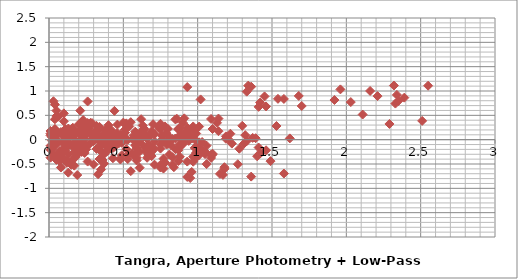
| Category | Series 0 |
|---|---|
| 0.03999999999999915 | 0.722 |
| 0.16000000000000014 | 0.245 |
| 0.1999999999999993 | 0.313 |
| 0.20999999999999908 | 0.188 |
| 0.22000000000000064 | 0.367 |
| 0.23000000000000043 | -0.004 |
| 0.2599999999999998 | 0.785 |
| 0.33999999999999986 | 0.213 |
| 0.39000000000000057 | 0.107 |
| 0.4399999999999995 | 0.592 |
| 0.5199999999999996 | 0.335 |
| 0.5899999999999999 | 0.075 |
| 0.629999999999999 | 0.293 |
| 0.8499999999999996 | 0.417 |
| 0.8699999999999992 | 0.209 |
| 0.9700000000000006 | 0.271 |
| 1.0099999999999998 | 0.269 |
| 1.0899999999999999 | 0.425 |
| 1.0999999999999996 | 0.219 |
| 1.129999999999999 | 0.346 |
| 1.1400000000000006 | 0.434 |
| 1.1899999999999995 | 0.019 |
| 1.209999999999999 | -0.002 |
| 1.2200000000000006 | 0.122 |
| 1.5299999999999994 | 0.281 |
| 1.6199999999999992 | 0.027 |
| 2.5500000000000007 | 1.108 |
| 0.120000000000001 | -0.477 |
| 0.16000000000000014 | -0.409 |
| 0.16999999999999993 | -0.534 |
| 0.1800000000000015 | -0.356 |
| 0.19000000000000128 | -0.726 |
| 0.22000000000000064 | 0.063 |
| 0.3000000000000007 | -0.509 |
| 0.3500000000000014 | -0.615 |
| 0.40000000000000036 | -0.13 |
| 0.4800000000000004 | -0.387 |
| 0.5500000000000007 | -0.647 |
| 0.5899999999999999 | -0.429 |
| 0.8100000000000005 | -0.306 |
| 0.8300000000000001 | -0.513 |
| 0.9300000000000015 | -0.451 |
| 0.9700000000000006 | -0.453 |
| 1.0500000000000007 | -0.297 |
| 1.0600000000000005 | -0.503 |
| 1.0899999999999999 | -0.376 |
| 1.1000000000000014 | -0.288 |
| 1.1500000000000004 | -0.703 |
| 1.17 | -0.724 |
| 1.1800000000000015 | -0.6 |
| 1.4900000000000002 | -0.441 |
| 1.58 | -0.696 |
| 2.5100000000000016 | 0.386 |
| 0.03999999999999915 | 0.068 |
| 0.049999999999998934 | -0.057 |
| 0.0600000000000005 | 0.122 |
| 0.07000000000000028 | -0.249 |
| 0.09999999999999964 | 0.54 |
| 0.17999999999999972 | -0.032 |
| 0.23000000000000043 | -0.138 |
| 0.27999999999999936 | 0.347 |
| 0.35999999999999943 | 0.09 |
| 0.4299999999999997 | -0.17 |
| 0.46999999999999886 | 0.048 |
| 0.6899999999999995 | 0.172 |
| 0.7099999999999991 | -0.036 |
| 0.8100000000000005 | 0.026 |
| 0.8499999999999996 | 0.024 |
| 0.9299999999999997 | 0.18 |
| 0.9399999999999995 | -0.026 |
| 0.9699999999999989 | 0.101 |
| 0.9800000000000004 | 0.189 |
| 1.0299999999999994 | -0.226 |
| 1.049999999999999 | -0.247 |
| 1.0600000000000005 | -0.123 |
| 1.3699999999999992 | 0.036 |
| 1.459999999999999 | -0.218 |
| 2.3900000000000006 | 0.863 |
| 0.009999999999999787 | -0.125 |
| 0.02000000000000135 | 0.054 |
| 0.030000000000001137 | -0.317 |
| 0.0600000000000005 | 0.473 |
| 0.14000000000000057 | -0.1 |
| 0.19000000000000128 | -0.206 |
| 0.2400000000000002 | 0.279 |
| 0.3200000000000003 | 0.023 |
| 0.39000000000000057 | -0.238 |
| 0.4299999999999997 | -0.019 |
| 0.6500000000000004 | 0.104 |
| 0.6699999999999999 | -0.103 |
| 0.7700000000000014 | -0.041 |
| 0.8100000000000005 | -0.044 |
| 0.8900000000000006 | 0.113 |
| 0.9000000000000004 | -0.094 |
| 0.9299999999999997 | 0.033 |
| 0.9400000000000013 | 0.121 |
| 0.9900000000000002 | -0.294 |
| 1.0099999999999998 | -0.315 |
| 1.0200000000000014 | -0.191 |
| 1.33 | -0.032 |
| 1.42 | -0.286 |
| 2.3500000000000014 | 0.795 |
| 0.010000000000001563 | 0.179 |
| 0.02000000000000135 | -0.192 |
| 0.05000000000000071 | 0.597 |
| 0.13000000000000078 | 0.025 |
| 0.1800000000000015 | -0.081 |
| 0.23000000000000043 | 0.404 |
| 0.3100000000000005 | 0.147 |
| 0.3800000000000008 | -0.113 |
| 0.41999999999999993 | 0.105 |
| 0.6400000000000006 | 0.228 |
| 0.6600000000000001 | 0.021 |
| 0.7600000000000016 | 0.083 |
| 0.8000000000000007 | 0.081 |
| 0.8800000000000008 | 0.237 |
| 0.8900000000000006 | 0.031 |
| 0.9199999999999999 | 0.158 |
| 0.9300000000000015 | 0.246 |
| 0.9800000000000004 | -0.169 |
| 1.0 | -0.19 |
| 1.0100000000000016 | -0.066 |
| 1.3200000000000003 | 0.093 |
| 1.4100000000000001 | -0.162 |
| 2.3400000000000016 | 0.92 |
| 0.009999999999999787 | -0.371 |
| 0.03999999999999915 | 0.419 |
| 0.11999999999999922 | -0.154 |
| 0.16999999999999993 | -0.259 |
| 0.21999999999999886 | 0.225 |
| 0.29999999999999893 | -0.031 |
| 0.3699999999999992 | -0.292 |
| 0.40999999999999837 | -0.073 |
| 0.629999999999999 | 0.05 |
| 0.6499999999999986 | -0.157 |
| 0.75 | -0.095 |
| 0.7899999999999991 | -0.098 |
| 0.8699999999999992 | 0.059 |
| 0.879999999999999 | -0.147 |
| 0.9099999999999984 | -0.02 |
| 0.9199999999999999 | 0.068 |
| 0.9699999999999989 | -0.348 |
| 0.9899999999999984 | -0.369 |
| 1.0 | -0.245 |
| 1.3099999999999987 | -0.086 |
| 1.3999999999999986 | -0.34 |
| 2.33 | 0.742 |
| 0.02999999999999936 | 0.789 |
| 0.10999999999999943 | 0.217 |
| 0.16000000000000014 | 0.111 |
| 0.20999999999999908 | 0.596 |
| 0.28999999999999915 | 0.339 |
| 0.35999999999999943 | 0.079 |
| 0.3999999999999986 | 0.297 |
| 0.6199999999999992 | 0.42 |
| 0.6399999999999988 | 0.213 |
| 0.7400000000000002 | 0.275 |
| 0.7799999999999994 | 0.273 |
| 0.8599999999999994 | 0.429 |
| 0.8699999999999992 | 0.223 |
| 0.8999999999999986 | 0.35 |
| 0.9100000000000001 | 0.438 |
| 0.9599999999999991 | 0.023 |
| 0.9799999999999986 | 0.002 |
| 0.9900000000000002 | 0.126 |
| 1.299999999999999 | 0.285 |
| 1.3899999999999988 | 0.03 |
| 2.3200000000000003 | 1.112 |
| 0.08000000000000007 | -0.572 |
| 0.13000000000000078 | -0.678 |
| 0.17999999999999972 | -0.194 |
| 0.2599999999999998 | -0.45 |
| 0.33000000000000007 | -0.71 |
| 0.3699999999999992 | -0.492 |
| 0.5899999999999999 | -0.369 |
| 0.6099999999999994 | -0.576 |
| 0.7100000000000009 | -0.514 |
| 0.75 | -0.516 |
| 0.8300000000000001 | -0.36 |
| 0.8399999999999999 | -0.566 |
| 0.8699999999999992 | -0.439 |
| 0.8800000000000008 | -0.351 |
| 0.9299999999999997 | -0.767 |
| 0.9499999999999993 | -0.788 |
| 0.9600000000000009 | -0.664 |
| 1.2699999999999996 | -0.504 |
| 1.3599999999999994 | -0.759 |
| 2.290000000000001 | 0.323 |
| 0.05000000000000071 | -0.106 |
| 0.09999999999999964 | 0.379 |
| 0.17999999999999972 | 0.122 |
| 0.25 | -0.138 |
| 0.28999999999999915 | 0.08 |
| 0.5099999999999998 | 0.203 |
| 0.5299999999999994 | -0.004 |
| 0.6300000000000008 | 0.058 |
| 0.6699999999999999 | 0.056 |
| 0.75 | 0.212 |
| 0.7599999999999998 | 0.006 |
| 0.7899999999999991 | 0.133 |
| 0.8000000000000007 | 0.221 |
| 0.8499999999999996 | -0.194 |
| 0.8699999999999992 | -0.215 |
| 0.8800000000000008 | -0.091 |
| 1.1899999999999995 | 0.068 |
| 1.2799999999999994 | -0.187 |
| 2.210000000000001 | 0.895 |
| 0.049999999999998934 | 0.485 |
| 0.129999999999999 | 0.228 |
| 0.1999999999999993 | -0.032 |
| 0.23999999999999844 | 0.186 |
| 0.4599999999999991 | 0.309 |
| 0.47999999999999865 | 0.102 |
| 0.5800000000000001 | 0.164 |
| 0.6199999999999992 | 0.162 |
| 0.6999999999999993 | 0.318 |
| 0.7099999999999991 | 0.112 |
| 0.7399999999999984 | 0.239 |
| 0.75 | 0.327 |
| 0.7999999999999989 | -0.088 |
| 0.8199999999999985 | -0.109 |
| 0.8300000000000001 | 0.015 |
| 1.1399999999999988 | 0.174 |
| 1.2299999999999986 | -0.081 |
| 2.16 | 1.001 |
| 0.08000000000000007 | -0.256 |
| 0.15000000000000036 | -0.517 |
| 0.1899999999999995 | -0.298 |
| 0.41000000000000014 | -0.175 |
| 0.4299999999999997 | -0.382 |
| 0.5300000000000011 | -0.32 |
| 0.5700000000000003 | -0.323 |
| 0.6500000000000004 | -0.166 |
| 0.6600000000000001 | -0.373 |
| 0.6899999999999995 | -0.246 |
| 0.7000000000000011 | -0.158 |
| 0.75 | -0.573 |
| 0.7699999999999996 | -0.594 |
| 0.7800000000000011 | -0.47 |
| 1.0899999999999999 | -0.311 |
| 1.1799999999999997 | -0.565 |
| 2.110000000000001 | 0.516 |
| 0.07000000000000028 | -0.26 |
| 0.10999999999999943 | -0.042 |
| 0.33000000000000007 | 0.081 |
| 0.34999999999999964 | -0.126 |
| 0.45000000000000107 | -0.064 |
| 0.4900000000000002 | -0.066 |
| 0.5700000000000003 | 0.09 |
| 0.5800000000000001 | -0.116 |
| 0.6099999999999994 | 0.011 |
| 0.620000000000001 | 0.099 |
| 0.6699999999999999 | -0.317 |
| 0.6899999999999995 | -0.338 |
| 0.7000000000000011 | -0.213 |
| 1.0099999999999998 | -0.054 |
| 1.0999999999999996 | -0.309 |
| 2.030000000000001 | 0.773 |
| 0.03999999999999915 | 0.218 |
| 0.2599999999999998 | 0.342 |
| 0.27999999999999936 | 0.134 |
| 0.3800000000000008 | 0.196 |
| 0.41999999999999993 | 0.194 |
| 0.5 | 0.35 |
| 0.5099999999999998 | 0.144 |
| 0.5399999999999991 | 0.271 |
| 0.5500000000000007 | 0.359 |
| 0.5999999999999996 | -0.056 |
| 0.6199999999999992 | -0.077 |
| 0.6300000000000008 | 0.047 |
| 0.9399999999999995 | 0.206 |
| 1.0299999999999994 | -0.048 |
| 1.9600000000000009 | 1.033 |
| 0.22000000000000064 | 0.123 |
| 0.2400000000000002 | -0.084 |
| 0.34000000000000163 | -0.022 |
| 0.3800000000000008 | -0.024 |
| 0.46000000000000085 | 0.132 |
| 0.47000000000000064 | -0.074 |
| 0.5 | 0.053 |
| 0.5100000000000016 | 0.141 |
| 0.5600000000000005 | -0.275 |
| 0.5800000000000001 | -0.296 |
| 0.5900000000000016 | -0.171 |
| 0.9000000000000004 | -0.012 |
| 0.9900000000000002 | -0.267 |
| 1.9200000000000017 | 0.815 |
| 0.019999999999999574 | -0.207 |
| 0.120000000000001 | -0.145 |
| 0.16000000000000014 | -0.147 |
| 0.2400000000000002 | 0.009 |
| 0.25 | -0.197 |
| 0.27999999999999936 | -0.07 |
| 0.2900000000000009 | 0.018 |
| 0.33999999999999986 | -0.398 |
| 0.35999999999999943 | -0.419 |
| 0.370000000000001 | -0.295 |
| 0.6799999999999997 | -0.135 |
| 0.7699999999999996 | -0.39 |
| 1.700000000000001 | 0.692 |
| 0.10000000000000142 | 0.062 |
| 0.14000000000000057 | 0.06 |
| 0.22000000000000064 | 0.216 |
| 0.23000000000000043 | 0.01 |
| 0.2599999999999998 | 0.137 |
| 0.27000000000000135 | 0.225 |
| 0.3200000000000003 | -0.191 |
| 0.33999999999999986 | -0.212 |
| 0.3500000000000014 | -0.087 |
| 0.6600000000000001 | 0.072 |
| 0.75 | -0.183 |
| 1.6800000000000015 | 0.899 |
| 0.03999999999999915 | -0.002 |
| 0.11999999999999922 | 0.154 |
| 0.129999999999999 | -0.052 |
| 0.15999999999999837 | 0.075 |
| 0.16999999999999993 | 0.163 |
| 0.21999999999999886 | -0.253 |
| 0.23999999999999844 | -0.274 |
| 0.25 | -0.149 |
| 0.5599999999999987 | 0.01 |
| 0.6499999999999986 | -0.245 |
| 1.58 | 0.837 |
| 0.08000000000000007 | 0.156 |
| 0.08999999999999986 | -0.05 |
| 0.11999999999999922 | 0.077 |
| 0.13000000000000078 | 0.165 |
| 0.17999999999999972 | -0.25 |
| 0.1999999999999993 | -0.271 |
| 0.21000000000000085 | -0.147 |
| 0.5199999999999996 | 0.012 |
| 0.6099999999999994 | -0.243 |
| 1.540000000000001 | 0.839 |
| 0.009999999999999787 | -0.206 |
| 0.03999999999999915 | -0.079 |
| 0.05000000000000071 | 0.009 |
| 0.09999999999999964 | -0.407 |
| 0.11999999999999922 | -0.428 |
| 0.13000000000000078 | -0.304 |
| 0.4399999999999995 | -0.144 |
| 0.5299999999999994 | -0.399 |
| 1.4600000000000009 | 0.683 |
| 0.02999999999999936 | 0.127 |
| 0.040000000000000924 | 0.215 |
| 0.08999999999999986 | -0.201 |
| 0.10999999999999943 | -0.221 |
| 0.120000000000001 | -0.097 |
| 0.4299999999999997 | 0.062 |
| 0.5199999999999996 | -0.193 |
| 1.450000000000001 | 0.889 |
| 0.010000000000001563 | 0.088 |
| 0.0600000000000005 | -0.327 |
| 0.08000000000000007 | -0.348 |
| 0.09000000000000163 | -0.224 |
| 0.40000000000000036 | -0.065 |
| 0.4900000000000002 | -0.32 |
| 1.4200000000000017 | 0.762 |
| 0.049999999999998934 | -0.415 |
| 0.06999999999999851 | -0.436 |
| 0.08000000000000007 | -0.312 |
| 0.3899999999999988 | -0.153 |
| 0.47999999999999865 | -0.408 |
| 1.4100000000000001 | 0.674 |
| 0.019999999999999574 | -0.021 |
| 0.030000000000001137 | 0.103 |
| 0.33999999999999986 | 0.262 |
| 0.4299999999999997 | 0.008 |
| 1.3600000000000012 | 1.089 |
| 0.010000000000001563 | 0.124 |
| 0.3200000000000003 | 0.283 |
| 0.41000000000000014 | 0.029 |
| 1.3400000000000016 | 1.11 |
| 0.3099999999999987 | 0.159 |
| 0.3999999999999986 | -0.095 |
| 1.33 | 0.986 |
| 0.08999999999999986 | -0.255 |
| 1.0200000000000014 | 0.827 |
| 0.9300000000000015 | 1.082 |